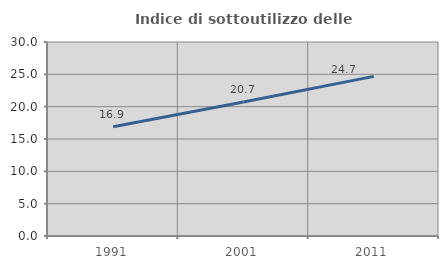
| Category | Indice di sottoutilizzo delle abitazioni  |
|---|---|
| 1991.0 | 16.886 |
| 2001.0 | 20.73 |
| 2011.0 | 24.684 |